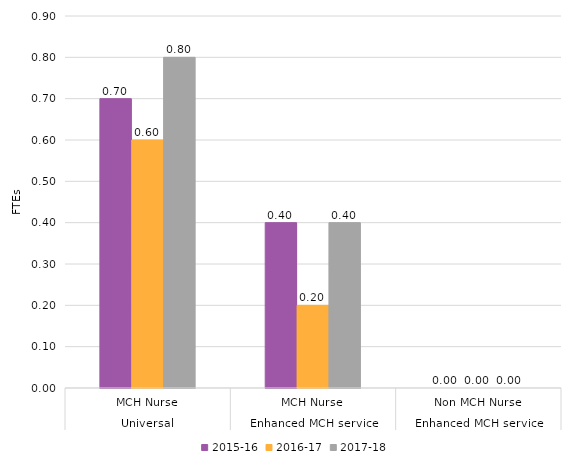
| Category | 2015-16 | 2016-17 | 2017-18 |
|---|---|---|---|
| 0 | 0.7 | 0.6 | 0.8 |
| 1 | 0.4 | 0.2 | 0.4 |
| 2 | 0 | 0 | 0 |